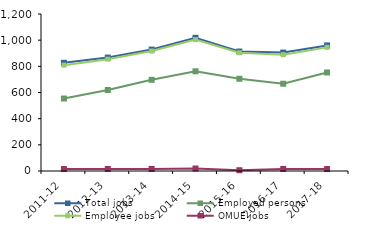
| Category | Total jobs | Employed persons | Employee jobs | OMUE jobs |
|---|---|---|---|---|
| 2011-12 | 827 | 554 | 809 | 15 |
| 2012-13 | 867 | 619 | 855 | 16 |
| 2013-14 | 928 | 697 | 917 | 16 |
| 2014-15 | 1018 | 762 | 1004 | 19 |
| 2015-16 | 913 | 705 | 904 | 6 |
| 2016-17 | 905 | 667 | 889 | 16 |
| 2017-18 | 960 | 753 | 945 | 15 |